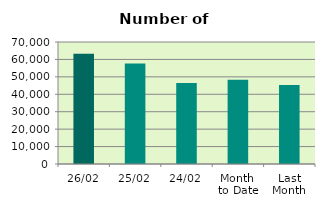
| Category | Series 0 |
|---|---|
| 26/02 | 63300 |
| 25/02 | 57722 |
| 24/02 | 46404 |
| Month 
to Date | 48363.3 |
| Last
Month | 45378.8 |